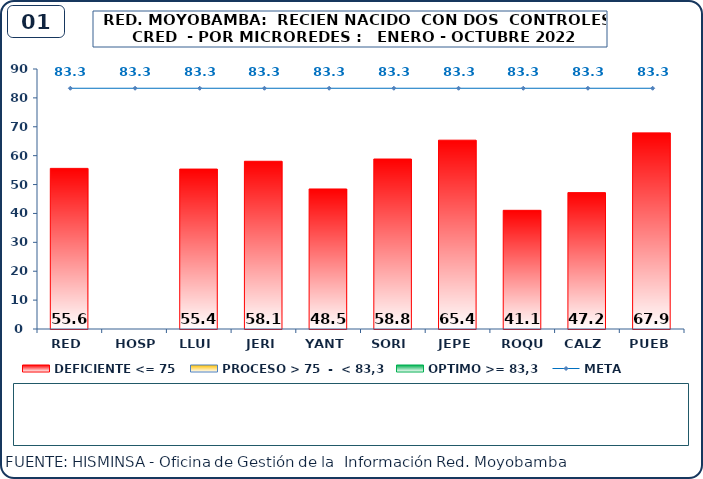
| Category | DEFICIENTE <= 75 | PROCESO > 75  -  < 83,3 | OPTIMO >= 83,3 |
|---|---|---|---|
| RED | 55.6 | 0 | 0 |
| HOSP | 0 | 0 | 0 |
| LLUI | 55.36 | 0 | 0 |
| JERI | 58.06 | 0 | 0 |
| YANT | 48.47 | 0 | 0 |
| SORI | 58.84 | 0 | 0 |
| JEPE | 65.36 | 0 | 0 |
| ROQU | 41.08 | 0 | 0 |
| CALZ | 47.22 | 0 | 0 |
| PUEB | 67.9 | 0 | 0 |